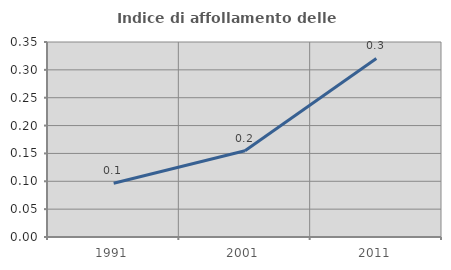
| Category | Indice di affollamento delle abitazioni  |
|---|---|
| 1991.0 | 0.097 |
| 2001.0 | 0.155 |
| 2011.0 | 0.321 |